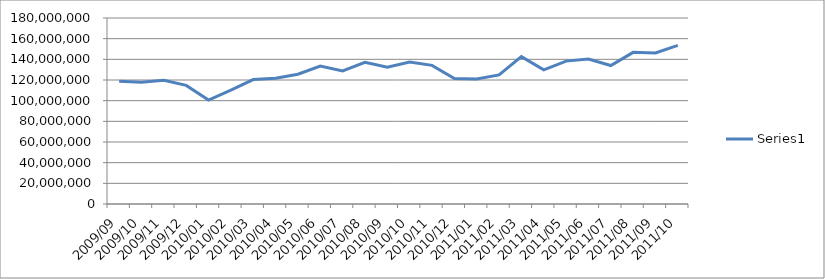
| Category | Series 0 |
|---|---|
| 2009/09 | 118876681 |
| 2009/10 | 117823650 |
| 2009/11 | 119830561 |
| 2009/12 | 114792356 |
| 2010/01 | 100573193 |
| 2010/02 | 110286004 |
| 2010/03 | 120449235 |
| 2010/04 | 121686480 |
| 2010/05 | 125630640 |
| 2010/06 | 133531212 |
| 2010/07 | 128804381 |
| 2010/08 | 137046068 |
| 2010/09 | 132316135 |
| 2010/10 | 137358862 |
| 2010/11 | 134183713 |
| 2010/12 | 121365479 |
| 2011/01 | 120976509 |
| 2011/02 | 124889558 |
| 2011/03 | 142637435 |
| 2011/04 | 129867433 |
| 2011/05 | 138285292 |
| 2011/06 | 140200175 |
| 2011/07 | 134017798 |
| 2011/08 | 146760445 |
| 2011/09 | 146227238 |
| 2011/10 | 153436170 |